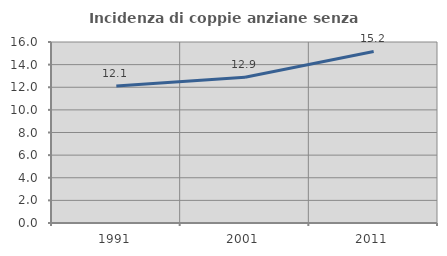
| Category | Incidenza di coppie anziane senza figli  |
|---|---|
| 1991.0 | 12.117 |
| 2001.0 | 12.891 |
| 2011.0 | 15.162 |